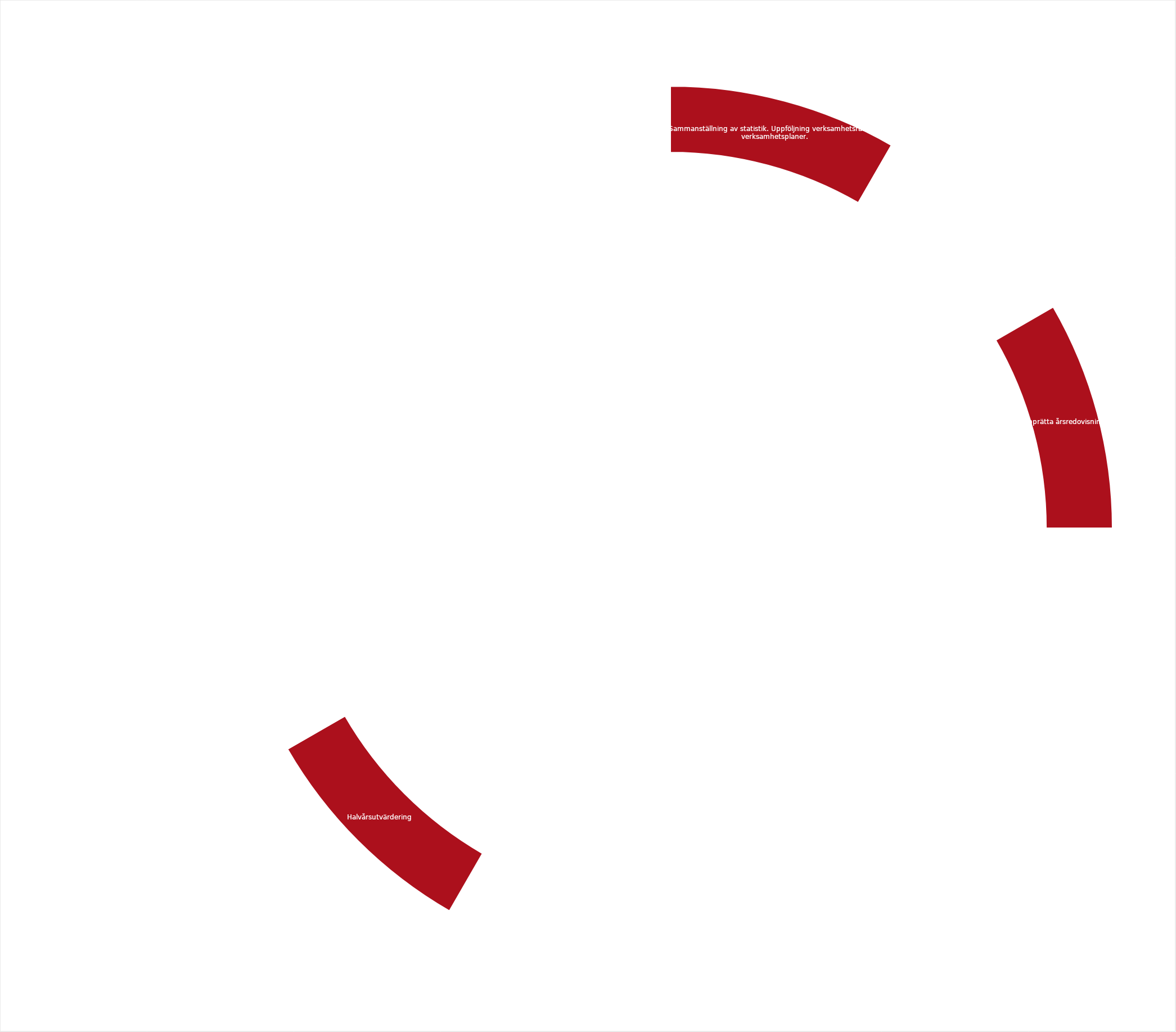
| Category | Series 0 |
|---|---|
| Sammanställning av statistik. Uppföljning verksamhetsram och verksamhetsplaner.  | 1 |
|  | 1 |
| Upprätta årsredovisning | 1 |
|  | 1 |
|  | 1 |
|  | 1 |
|  | 1 |
| Halvårsutvärdering | 1 |